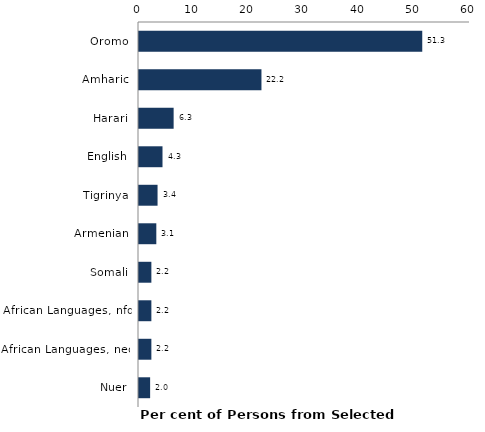
| Category | Series 0 |
|---|---|
| Oromo | 51.345 |
| Amharic | 22.197 |
| Harari | 6.278 |
| English | 4.26 |
| Tigrinya | 3.363 |
| Armenian | 3.139 |
| Somali | 2.242 |
| African Languages, nfd | 2.242 |
| African Languages, nec | 2.242 |
| Nuer | 2.018 |